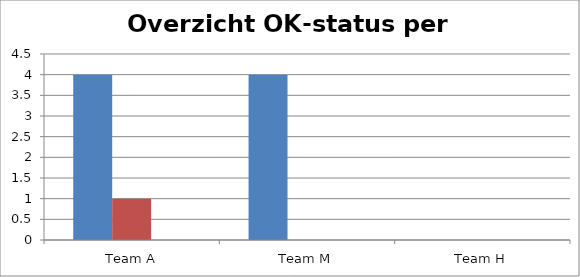
| Category | Series 0 | Series 1 | Per OK-status |
|---|---|---|---|
| Team A | 4 | 1 | 0 |
| Team M | 4 | 0 | 0 |
| Team H | 0 | 0 | 0 |